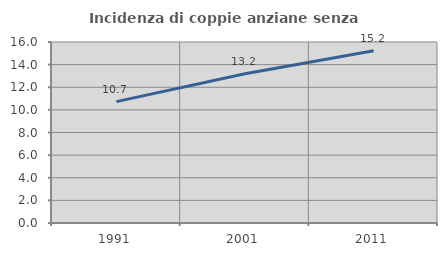
| Category | Incidenza di coppie anziane senza figli  |
|---|---|
| 1991.0 | 10.729 |
| 2001.0 | 13.191 |
| 2011.0 | 15.225 |